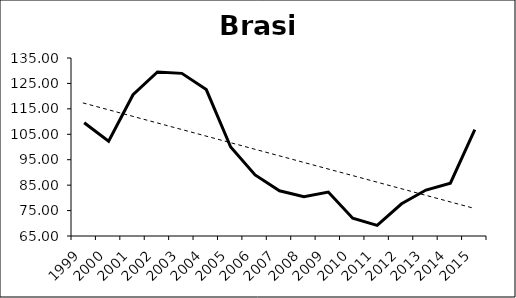
| Category | Series 0 |
|---|---|
| 1999.0 | 109.51 |
| 2000.0 | 102.3 |
| 2001.0 | 120.56 |
| 2002.0 | 129.5 |
| 2003.0 | 128.96 |
| 2004.0 | 122.59 |
| 2005.0 | 100 |
| 2006.0 | 89.01 |
| 2007.0 | 82.78 |
| 2008.0 | 80.41 |
| 2009.0 | 82.3 |
| 2010.0 | 71.98 |
| 2011.0 | 69.17 |
| 2012.0 | 77.66 |
| 2013.0 | 83.08 |
| 2014.0 | 85.79 |
| 2015.0 | 106.88 |